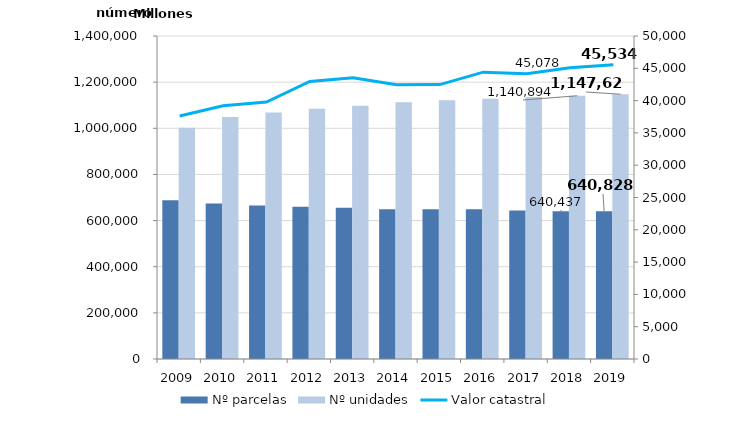
| Category | Nº parcelas | Nº unidades |
|---|---|---|
| 2009.0 | 688282 | 1002438 |
| 2010.0 | 674358 | 1049029 |
| 2011.0 | 664963 | 1068556 |
| 2012.0 | 659476 | 1084868 |
| 2013.0 | 655509 | 1098151 |
| 2014.0 | 648587 | 1112891 |
| 2015.0 | 649060 | 1121255 |
| 2016.0 | 649298 | 1128546 |
| 2017.0 | 643134 | 1135222 |
| 2018.0 | 640437 | 1140894 |
| 2019.0 | 640828 | 1147626 |